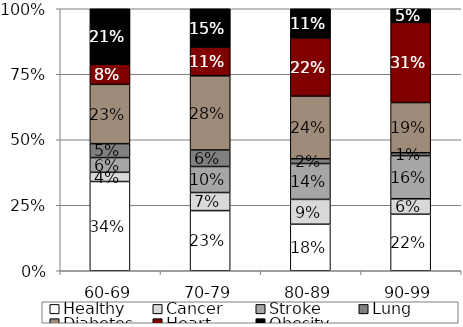
| Category | Healthy | Cancer | Stroke | Lung | Diabetes | Heart | Obesity |
|---|---|---|---|---|---|---|---|
| 60-69 | 0.341 | 0.035 | 0.056 | 0.053 | 0.226 | 0.077 | 0.212 |
| 70-79 | 0.23 | 0.069 | 0.099 | 0.063 | 0.283 | 0.11 | 0.146 |
| 80-89 | 0.178 | 0.095 | 0.137 | 0.018 | 0.239 | 0.222 | 0.111 |
| 90-99 | 0.216 | 0.059 | 0.165 | 0.011 | 0.192 | 0.306 | 0.052 |